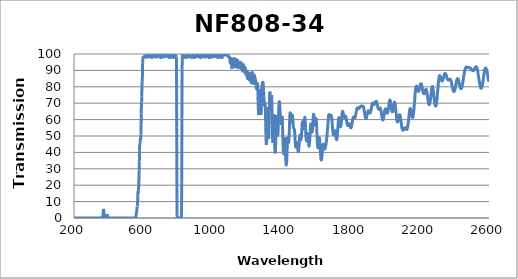
| Category | Transmission (%) |
|---|---|
| 2600.0 | 83.249 |
| 2599.0 | 83.474 |
| 2598.0 | 83.805 |
| 2597.0 | 84.233 |
| 2596.0 | 84.768 |
| 2595.0 | 85.304 |
| 2594.0 | 85.898 |
| 2593.0 | 86.514 |
| 2592.0 | 87.123 |
| 2591.0 | 87.732 |
| 2590.0 | 88.328 |
| 2589.0 | 88.871 |
| 2588.0 | 89.407 |
| 2587.0 | 89.887 |
| 2586.0 | 90.31 |
| 2585.0 | 90.655 |
| 2584.0 | 90.932 |
| 2583.0 | 91.135 |
| 2582.0 | 91.355 |
| 2581.0 | 91.422 |
| 2580.0 | 91.437 |
| 2579.0 | 91.336 |
| 2578.0 | 91.164 |
| 2577.0 | 90.976 |
| 2576.0 | 90.688 |
| 2575.0 | 90.374 |
| 2574.0 | 89.967 |
| 2573.0 | 89.405 |
| 2572.0 | 88.771 |
| 2571.0 | 88.119 |
| 2570.0 | 87.284 |
| 2569.0 | 86.465 |
| 2568.0 | 85.613 |
| 2567.0 | 84.791 |
| 2566.0 | 83.966 |
| 2565.0 | 83.229 |
| 2564.0 | 82.455 |
| 2563.0 | 81.78 |
| 2562.0 | 81.177 |
| 2561.0 | 80.667 |
| 2560.0 | 80.219 |
| 2559.0 | 79.85 |
| 2558.0 | 79.559 |
| 2557.0 | 79.34 |
| 2556.0 | 79.2 |
| 2555.0 | 79.101 |
| 2554.0 | 79.089 |
| 2553.0 | 79.155 |
| 2552.0 | 79.296 |
| 2551.0 | 79.513 |
| 2550.0 | 79.869 |
| 2549.0 | 80.3 |
| 2548.0 | 80.812 |
| 2547.0 | 81.37 |
| 2546.0 | 81.942 |
| 2545.0 | 82.56 |
| 2544.0 | 83.208 |
| 2543.0 | 83.871 |
| 2542.0 | 84.523 |
| 2541.0 | 85.224 |
| 2540.0 | 85.911 |
| 2539.0 | 86.58 |
| 2538.0 | 87.285 |
| 2537.0 | 87.954 |
| 2536.0 | 88.644 |
| 2535.0 | 89.293 |
| 2534.0 | 89.881 |
| 2533.0 | 90.419 |
| 2532.0 | 90.877 |
| 2531.0 | 91.323 |
| 2530.0 | 91.643 |
| 2529.0 | 91.861 |
| 2528.0 | 92.079 |
| 2527.0 | 92.198 |
| 2526.0 | 92.234 |
| 2525.0 | 92.279 |
| 2524.0 | 92.254 |
| 2523.0 | 92.177 |
| 2522.0 | 92.034 |
| 2521.0 | 91.86 |
| 2520.0 | 91.684 |
| 2519.0 | 91.476 |
| 2518.0 | 91.227 |
| 2517.0 | 91.018 |
| 2516.0 | 90.808 |
| 2515.0 | 90.555 |
| 2514.0 | 90.349 |
| 2513.0 | 90.176 |
| 2512.0 | 90.049 |
| 2511.0 | 89.955 |
| 2510.0 | 89.863 |
| 2509.0 | 89.808 |
| 2508.0 | 89.789 |
| 2507.0 | 89.793 |
| 2506.0 | 89.842 |
| 2505.0 | 89.918 |
| 2504.0 | 90.023 |
| 2503.0 | 90.138 |
| 2502.0 | 90.24 |
| 2501.0 | 90.337 |
| 2500.0 | 90.447 |
| 2499.0 | 90.594 |
| 2498.0 | 90.768 |
| 2497.0 | 90.912 |
| 2496.0 | 91.064 |
| 2495.0 | 91.179 |
| 2494.0 | 91.26 |
| 2493.0 | 91.336 |
| 2492.0 | 91.417 |
| 2491.0 | 91.494 |
| 2490.0 | 91.554 |
| 2489.0 | 91.598 |
| 2488.0 | 91.65 |
| 2487.0 | 91.678 |
| 2486.0 | 91.663 |
| 2485.0 | 91.653 |
| 2484.0 | 91.689 |
| 2483.0 | 91.732 |
| 2482.0 | 91.744 |
| 2481.0 | 91.757 |
| 2480.0 | 91.778 |
| 2479.0 | 91.787 |
| 2478.0 | 91.803 |
| 2477.0 | 91.833 |
| 2476.0 | 91.89 |
| 2475.0 | 91.925 |
| 2474.0 | 91.972 |
| 2473.0 | 91.999 |
| 2472.0 | 92.037 |
| 2471.0 | 92.051 |
| 2470.0 | 92.058 |
| 2469.0 | 92.045 |
| 2468.0 | 92.013 |
| 2467.0 | 91.921 |
| 2466.0 | 91.786 |
| 2465.0 | 91.591 |
| 2464.0 | 91.369 |
| 2463.0 | 91.117 |
| 2462.0 | 90.786 |
| 2461.0 | 90.395 |
| 2460.0 | 89.966 |
| 2459.0 | 89.498 |
| 2458.0 | 88.992 |
| 2457.0 | 88.429 |
| 2456.0 | 87.829 |
| 2455.0 | 87.164 |
| 2454.0 | 86.479 |
| 2453.0 | 85.783 |
| 2452.0 | 85.083 |
| 2451.0 | 84.397 |
| 2450.0 | 83.703 |
| 2449.0 | 83.022 |
| 2448.0 | 82.385 |
| 2447.0 | 81.786 |
| 2446.0 | 81.225 |
| 2445.0 | 80.699 |
| 2444.0 | 80.219 |
| 2443.0 | 79.833 |
| 2442.0 | 79.511 |
| 2441.0 | 79.226 |
| 2440.0 | 79.014 |
| 2439.0 | 78.884 |
| 2438.0 | 78.842 |
| 2437.0 | 78.886 |
| 2436.0 | 79.028 |
| 2435.0 | 79.235 |
| 2434.0 | 79.479 |
| 2433.0 | 79.78 |
| 2432.0 | 80.137 |
| 2431.0 | 80.578 |
| 2430.0 | 81.059 |
| 2429.0 | 81.555 |
| 2428.0 | 82.057 |
| 2427.0 | 82.557 |
| 2426.0 | 83.053 |
| 2425.0 | 83.503 |
| 2424.0 | 83.909 |
| 2423.0 | 84.267 |
| 2422.0 | 84.576 |
| 2421.0 | 84.802 |
| 2420.0 | 84.936 |
| 2419.0 | 84.987 |
| 2418.0 | 84.958 |
| 2417.0 | 84.858 |
| 2416.0 | 84.704 |
| 2415.0 | 84.451 |
| 2414.0 | 84.08 |
| 2413.0 | 83.666 |
| 2412.0 | 83.191 |
| 2411.0 | 82.644 |
| 2410.0 | 82.121 |
| 2409.0 | 81.589 |
| 2408.0 | 81.003 |
| 2407.0 | 80.43 |
| 2406.0 | 79.873 |
| 2405.0 | 79.322 |
| 2404.0 | 78.833 |
| 2403.0 | 78.382 |
| 2402.0 | 77.973 |
| 2401.0 | 77.652 |
| 2400.0 | 77.399 |
| 2399.0 | 77.225 |
| 2398.0 | 77.127 |
| 2397.0 | 77.105 |
| 2396.0 | 77.162 |
| 2395.0 | 77.265 |
| 2394.0 | 77.455 |
| 2393.0 | 77.736 |
| 2392.0 | 78.069 |
| 2391.0 | 78.462 |
| 2390.0 | 78.916 |
| 2389.0 | 79.401 |
| 2388.0 | 79.928 |
| 2387.0 | 80.481 |
| 2386.0 | 81.006 |
| 2385.0 | 81.531 |
| 2384.0 | 82.045 |
| 2383.0 | 82.517 |
| 2382.0 | 82.941 |
| 2381.0 | 83.339 |
| 2380.0 | 83.682 |
| 2379.0 | 83.998 |
| 2378.0 | 84.236 |
| 2377.0 | 84.389 |
| 2376.0 | 84.501 |
| 2375.0 | 84.576 |
| 2374.0 | 84.596 |
| 2373.0 | 84.561 |
| 2372.0 | 84.548 |
| 2371.0 | 84.515 |
| 2370.0 | 84.426 |
| 2369.0 | 84.33 |
| 2368.0 | 84.231 |
| 2367.0 | 84.155 |
| 2366.0 | 84.112 |
| 2365.0 | 84.076 |
| 2364.0 | 84.087 |
| 2363.0 | 84.155 |
| 2362.0 | 84.274 |
| 2361.0 | 84.426 |
| 2360.0 | 84.624 |
| 2359.0 | 84.848 |
| 2358.0 | 85.116 |
| 2357.0 | 85.423 |
| 2356.0 | 85.768 |
| 2355.0 | 86.133 |
| 2354.0 | 86.492 |
| 2353.0 | 86.843 |
| 2352.0 | 87.151 |
| 2351.0 | 87.448 |
| 2350.0 | 87.695 |
| 2349.0 | 87.897 |
| 2348.0 | 88.068 |
| 2347.0 | 88.184 |
| 2346.0 | 88.223 |
| 2345.0 | 88.169 |
| 2344.0 | 88.028 |
| 2343.0 | 87.819 |
| 2342.0 | 87.526 |
| 2341.0 | 87.204 |
| 2340.0 | 86.854 |
| 2339.0 | 86.477 |
| 2338.0 | 86.07 |
| 2337.0 | 85.651 |
| 2336.0 | 85.237 |
| 2335.0 | 84.835 |
| 2334.0 | 84.47 |
| 2333.0 | 84.167 |
| 2332.0 | 83.926 |
| 2331.0 | 83.703 |
| 2330.0 | 83.546 |
| 2329.0 | 83.49 |
| 2328.0 | 83.514 |
| 2327.0 | 83.594 |
| 2326.0 | 83.76 |
| 2325.0 | 83.991 |
| 2324.0 | 84.255 |
| 2323.0 | 84.571 |
| 2322.0 | 84.916 |
| 2321.0 | 85.287 |
| 2320.0 | 85.66 |
| 2319.0 | 86.018 |
| 2318.0 | 86.343 |
| 2317.0 | 86.623 |
| 2316.0 | 86.795 |
| 2315.0 | 86.84 |
| 2314.0 | 86.765 |
| 2313.0 | 86.53 |
| 2312.0 | 86.13 |
| 2311.0 | 85.584 |
| 2310.0 | 84.931 |
| 2309.0 | 84.146 |
| 2308.0 | 83.176 |
| 2307.0 | 82.114 |
| 2306.0 | 80.982 |
| 2305.0 | 79.713 |
| 2304.0 | 78.455 |
| 2303.0 | 77.16 |
| 2302.0 | 75.9 |
| 2301.0 | 74.7 |
| 2300.0 | 73.563 |
| 2299.0 | 72.479 |
| 2298.0 | 71.514 |
| 2297.0 | 70.598 |
| 2296.0 | 69.846 |
| 2295.0 | 69.229 |
| 2294.0 | 68.796 |
| 2293.0 | 68.467 |
| 2292.0 | 68.27 |
| 2291.0 | 68.216 |
| 2290.0 | 68.309 |
| 2289.0 | 68.523 |
| 2288.0 | 68.891 |
| 2287.0 | 69.395 |
| 2286.0 | 70.005 |
| 2285.0 | 70.811 |
| 2284.0 | 71.626 |
| 2283.0 | 72.534 |
| 2282.0 | 73.488 |
| 2281.0 | 74.469 |
| 2280.0 | 75.503 |
| 2279.0 | 76.525 |
| 2278.0 | 77.438 |
| 2277.0 | 78.274 |
| 2276.0 | 78.981 |
| 2275.0 | 79.543 |
| 2274.0 | 79.959 |
| 2273.0 | 80.164 |
| 2272.0 | 80.154 |
| 2271.0 | 79.959 |
| 2270.0 | 79.587 |
| 2269.0 | 79.031 |
| 2268.0 | 78.33 |
| 2267.0 | 77.513 |
| 2266.0 | 76.648 |
| 2265.0 | 75.7 |
| 2264.0 | 74.772 |
| 2263.0 | 73.795 |
| 2262.0 | 72.914 |
| 2261.0 | 72.054 |
| 2260.0 | 71.293 |
| 2259.0 | 70.619 |
| 2258.0 | 70.057 |
| 2257.0 | 69.633 |
| 2256.0 | 69.33 |
| 2255.0 | 69.157 |
| 2254.0 | 69.1 |
| 2253.0 | 69.189 |
| 2252.0 | 69.394 |
| 2251.0 | 69.725 |
| 2250.0 | 70.163 |
| 2249.0 | 70.71 |
| 2248.0 | 71.338 |
| 2247.0 | 72.028 |
| 2246.0 | 72.734 |
| 2245.0 | 73.535 |
| 2244.0 | 74.318 |
| 2243.0 | 75.073 |
| 2242.0 | 75.852 |
| 2241.0 | 76.521 |
| 2240.0 | 77.118 |
| 2239.0 | 77.642 |
| 2238.0 | 77.984 |
| 2237.0 | 78.269 |
| 2236.0 | 78.424 |
| 2235.0 | 78.451 |
| 2234.0 | 78.373 |
| 2233.0 | 78.232 |
| 2232.0 | 77.987 |
| 2231.0 | 77.664 |
| 2230.0 | 77.312 |
| 2229.0 | 76.936 |
| 2228.0 | 76.617 |
| 2227.0 | 76.305 |
| 2226.0 | 76.087 |
| 2225.0 | 75.903 |
| 2224.0 | 75.802 |
| 2223.0 | 75.768 |
| 2222.0 | 75.858 |
| 2221.0 | 76.038 |
| 2220.0 | 76.29 |
| 2219.0 | 76.652 |
| 2218.0 | 77.065 |
| 2217.0 | 77.531 |
| 2216.0 | 78.082 |
| 2215.0 | 78.596 |
| 2214.0 | 79.158 |
| 2213.0 | 79.728 |
| 2212.0 | 80.239 |
| 2211.0 | 80.757 |
| 2210.0 | 81.196 |
| 2209.0 | 81.544 |
| 2208.0 | 81.779 |
| 2207.0 | 81.898 |
| 2206.0 | 81.888 |
| 2205.0 | 81.82 |
| 2204.0 | 81.619 |
| 2203.0 | 81.288 |
| 2202.0 | 80.915 |
| 2201.0 | 80.48 |
| 2200.0 | 79.928 |
| 2199.0 | 79.421 |
| 2198.0 | 78.903 |
| 2197.0 | 78.436 |
| 2196.0 | 78 |
| 2195.0 | 77.657 |
| 2194.0 | 77.357 |
| 2193.0 | 77.207 |
| 2192.0 | 77.171 |
| 2191.0 | 77.179 |
| 2190.0 | 77.275 |
| 2189.0 | 77.501 |
| 2188.0 | 77.845 |
| 2187.0 | 78.22 |
| 2186.0 | 78.633 |
| 2185.0 | 79.123 |
| 2184.0 | 79.543 |
| 2183.0 | 79.956 |
| 2182.0 | 80.265 |
| 2181.0 | 80.436 |
| 2180.0 | 80.454 |
| 2179.0 | 80.305 |
| 2178.0 | 80.031 |
| 2177.0 | 79.539 |
| 2176.0 | 78.858 |
| 2175.0 | 78.005 |
| 2174.0 | 77.033 |
| 2173.0 | 75.858 |
| 2172.0 | 74.599 |
| 2171.0 | 73.21 |
| 2170.0 | 71.83 |
| 2169.0 | 70.433 |
| 2168.0 | 69.056 |
| 2167.0 | 67.814 |
| 2166.0 | 66.551 |
| 2165.0 | 65.359 |
| 2164.0 | 64.316 |
| 2163.0 | 63.41 |
| 2162.0 | 62.644 |
| 2161.0 | 62.075 |
| 2160.0 | 61.613 |
| 2159.0 | 61.357 |
| 2158.0 | 61.255 |
| 2157.0 | 61.315 |
| 2156.0 | 61.529 |
| 2155.0 | 61.834 |
| 2154.0 | 62.274 |
| 2153.0 | 62.85 |
| 2152.0 | 63.454 |
| 2151.0 | 64.109 |
| 2150.0 | 64.701 |
| 2149.0 | 65.309 |
| 2148.0 | 65.852 |
| 2147.0 | 66.33 |
| 2146.0 | 66.629 |
| 2145.0 | 66.784 |
| 2144.0 | 66.767 |
| 2143.0 | 66.577 |
| 2142.0 | 66.204 |
| 2141.0 | 65.656 |
| 2140.0 | 64.95 |
| 2139.0 | 64.124 |
| 2138.0 | 63.221 |
| 2137.0 | 62.242 |
| 2136.0 | 61.244 |
| 2135.0 | 60.219 |
| 2134.0 | 59.216 |
| 2133.0 | 58.322 |
| 2132.0 | 57.454 |
| 2131.0 | 56.661 |
| 2130.0 | 55.979 |
| 2129.0 | 55.398 |
| 2128.0 | 54.879 |
| 2127.0 | 54.474 |
| 2126.0 | 54.189 |
| 2125.0 | 54.002 |
| 2124.0 | 53.918 |
| 2123.0 | 53.888 |
| 2122.0 | 53.932 |
| 2121.0 | 54.045 |
| 2120.0 | 54.211 |
| 2119.0 | 54.381 |
| 2118.0 | 54.547 |
| 2117.0 | 54.711 |
| 2116.0 | 54.874 |
| 2115.0 | 55.017 |
| 2114.0 | 55.076 |
| 2113.0 | 55.078 |
| 2112.0 | 55.018 |
| 2111.0 | 54.928 |
| 2110.0 | 54.751 |
| 2109.0 | 54.551 |
| 2108.0 | 54.329 |
| 2107.0 | 54.128 |
| 2106.0 | 53.94 |
| 2105.0 | 53.751 |
| 2104.0 | 53.593 |
| 2103.0 | 53.499 |
| 2102.0 | 53.487 |
| 2101.0 | 53.571 |
| 2100.0 | 53.756 |
| 2099.0 | 54.024 |
| 2098.0 | 54.39 |
| 2097.0 | 54.872 |
| 2096.0 | 55.413 |
| 2095.0 | 56.024 |
| 2094.0 | 56.726 |
| 2093.0 | 57.469 |
| 2092.0 | 58.264 |
| 2091.0 | 59.105 |
| 2090.0 | 59.864 |
| 2089.0 | 60.621 |
| 2088.0 | 61.308 |
| 2087.0 | 61.912 |
| 2086.0 | 62.417 |
| 2085.0 | 62.8 |
| 2084.0 | 62.962 |
| 2083.0 | 62.984 |
| 2082.0 | 62.865 |
| 2081.0 | 62.616 |
| 2080.0 | 62.271 |
| 2079.0 | 61.804 |
| 2078.0 | 61.25 |
| 2077.0 | 60.676 |
| 2076.0 | 60.149 |
| 2075.0 | 59.65 |
| 2074.0 | 59.236 |
| 2073.0 | 58.898 |
| 2072.0 | 58.663 |
| 2071.0 | 58.574 |
| 2070.0 | 58.662 |
| 2069.0 | 58.888 |
| 2068.0 | 59.265 |
| 2067.0 | 59.809 |
| 2066.0 | 60.509 |
| 2065.0 | 61.366 |
| 2064.0 | 62.323 |
| 2063.0 | 63.346 |
| 2062.0 | 64.413 |
| 2061.0 | 65.501 |
| 2060.0 | 66.61 |
| 2059.0 | 67.658 |
| 2058.0 | 68.571 |
| 2057.0 | 69.347 |
| 2056.0 | 69.934 |
| 2055.0 | 70.331 |
| 2054.0 | 70.536 |
| 2053.0 | 70.503 |
| 2052.0 | 70.273 |
| 2051.0 | 69.886 |
| 2050.0 | 69.373 |
| 2049.0 | 68.778 |
| 2048.0 | 68.129 |
| 2047.0 | 67.421 |
| 2046.0 | 66.72 |
| 2045.0 | 66.098 |
| 2044.0 | 65.582 |
| 2043.0 | 65.161 |
| 2042.0 | 64.858 |
| 2041.0 | 64.741 |
| 2040.0 | 64.805 |
| 2039.0 | 65.001 |
| 2038.0 | 65.344 |
| 2037.0 | 65.849 |
| 2036.0 | 66.507 |
| 2035.0 | 67.25 |
| 2034.0 | 68.054 |
| 2033.0 | 68.863 |
| 2032.0 | 69.651 |
| 2031.0 | 70.418 |
| 2030.0 | 71.074 |
| 2029.0 | 71.562 |
| 2028.0 | 71.873 |
| 2027.0 | 71.985 |
| 2026.0 | 71.891 |
| 2025.0 | 71.597 |
| 2024.0 | 71.101 |
| 2023.0 | 70.455 |
| 2022.0 | 69.723 |
| 2021.0 | 68.923 |
| 2020.0 | 68.069 |
| 2019.0 | 67.228 |
| 2018.0 | 66.405 |
| 2017.0 | 65.689 |
| 2016.0 | 65.101 |
| 2015.0 | 64.599 |
| 2014.0 | 64.206 |
| 2013.0 | 63.969 |
| 2012.0 | 63.907 |
| 2011.0 | 63.945 |
| 2010.0 | 64.067 |
| 2009.0 | 64.289 |
| 2008.0 | 64.602 |
| 2007.0 | 64.981 |
| 2006.0 | 65.38 |
| 2005.0 | 65.771 |
| 2004.0 | 66.124 |
| 2003.0 | 66.39 |
| 2002.0 | 66.546 |
| 2001.0 | 66.607 |
| 2000.0 | 66.519 |
| 1999.0 | 66.27 |
| 1998.0 | 65.881 |
| 1997.0 | 65.349 |
| 1996.0 | 64.723 |
| 1995.0 | 64.049 |
| 1994.0 | 63.316 |
| 1993.0 | 62.575 |
| 1992.0 | 61.868 |
| 1991.0 | 61.228 |
| 1990.0 | 60.678 |
| 1989.0 | 60.237 |
| 1988.0 | 59.92 |
| 1987.0 | 59.765 |
| 1986.0 | 59.75 |
| 1985.0 | 59.866 |
| 1984.0 | 60.108 |
| 1983.0 | 60.491 |
| 1982.0 | 60.993 |
| 1981.0 | 61.588 |
| 1980.0 | 62.263 |
| 1979.0 | 62.965 |
| 1978.0 | 63.67 |
| 1977.0 | 64.372 |
| 1976.0 | 65.02 |
| 1975.0 | 65.598 |
| 1974.0 | 66.093 |
| 1973.0 | 66.479 |
| 1972.0 | 66.759 |
| 1971.0 | 66.941 |
| 1970.0 | 67.028 |
| 1969.0 | 67.033 |
| 1968.0 | 66.954 |
| 1967.0 | 66.836 |
| 1966.0 | 66.706 |
| 1965.0 | 66.547 |
| 1964.0 | 66.392 |
| 1963.0 | 66.322 |
| 1962.0 | 66.326 |
| 1961.0 | 66.405 |
| 1960.0 | 66.578 |
| 1959.0 | 66.813 |
| 1958.0 | 67.147 |
| 1957.0 | 67.541 |
| 1956.0 | 68.018 |
| 1955.0 | 68.531 |
| 1954.0 | 69.027 |
| 1953.0 | 69.539 |
| 1952.0 | 70.044 |
| 1951.0 | 70.466 |
| 1950.0 | 70.789 |
| 1949.0 | 71.009 |
| 1948.0 | 71.152 |
| 1947.0 | 71.174 |
| 1946.0 | 71.084 |
| 1945.0 | 70.908 |
| 1944.0 | 70.678 |
| 1943.0 | 70.458 |
| 1942.0 | 70.216 |
| 1941.0 | 69.945 |
| 1940.0 | 69.684 |
| 1939.0 | 69.465 |
| 1938.0 | 69.309 |
| 1937.0 | 69.225 |
| 1936.0 | 69.23 |
| 1935.0 | 69.303 |
| 1934.0 | 69.426 |
| 1933.0 | 69.563 |
| 1932.0 | 69.696 |
| 1931.0 | 69.924 |
| 1930.0 | 70.042 |
| 1929.0 | 70.085 |
| 1928.0 | 70.131 |
| 1927.0 | 70.096 |
| 1926.0 | 69.947 |
| 1925.0 | 69.694 |
| 1924.0 | 69.388 |
| 1923.0 | 68.986 |
| 1922.0 | 68.415 |
| 1921.0 | 67.743 |
| 1920.0 | 67.097 |
| 1919.0 | 66.434 |
| 1918.0 | 65.832 |
| 1917.0 | 65.408 |
| 1916.0 | 65.037 |
| 1915.0 | 64.698 |
| 1914.0 | 64.374 |
| 1913.0 | 64.11 |
| 1912.0 | 63.996 |
| 1911.0 | 63.995 |
| 1910.0 | 64.123 |
| 1909.0 | 64.347 |
| 1908.0 | 64.591 |
| 1907.0 | 64.829 |
| 1906.0 | 65.067 |
| 1905.0 | 65.213 |
| 1904.0 | 65.305 |
| 1903.0 | 65.37 |
| 1902.0 | 65.399 |
| 1901.0 | 65.263 |
| 1900.0 | 64.995 |
| 1899.0 | 64.59 |
| 1898.0 | 64.083 |
| 1897.0 | 63.656 |
| 1896.0 | 63.271 |
| 1895.0 | 62.801 |
| 1894.0 | 62.384 |
| 1893.0 | 61.929 |
| 1892.0 | 61.418 |
| 1891.0 | 61.011 |
| 1890.0 | 60.722 |
| 1889.0 | 60.571 |
| 1888.0 | 60.659 |
| 1887.0 | 60.813 |
| 1886.0 | 61.084 |
| 1885.0 | 61.467 |
| 1884.0 | 61.934 |
| 1883.0 | 62.49 |
| 1882.0 | 63.081 |
| 1881.0 | 63.796 |
| 1880.0 | 64.547 |
| 1879.0 | 65.26 |
| 1878.0 | 65.977 |
| 1877.0 | 66.532 |
| 1876.0 | 67.002 |
| 1875.0 | 67.437 |
| 1874.0 | 67.775 |
| 1873.0 | 67.925 |
| 1872.0 | 68.081 |
| 1871.0 | 68.161 |
| 1870.0 | 68.192 |
| 1869.0 | 68.178 |
| 1868.0 | 68.202 |
| 1867.0 | 68.147 |
| 1866.0 | 68.214 |
| 1865.0 | 68.241 |
| 1864.0 | 68.259 |
| 1863.0 | 68.309 |
| 1862.0 | 68.328 |
| 1861.0 | 68.252 |
| 1860.0 | 68.213 |
| 1859.0 | 68.133 |
| 1858.0 | 68.037 |
| 1857.0 | 68.001 |
| 1856.0 | 67.958 |
| 1855.0 | 67.878 |
| 1854.0 | 67.724 |
| 1853.0 | 67.516 |
| 1852.0 | 67.318 |
| 1851.0 | 67.204 |
| 1850.0 | 67.13 |
| 1849.0 | 67.065 |
| 1848.0 | 66.965 |
| 1847.0 | 66.722 |
| 1846.0 | 66.746 |
| 1845.0 | 66.655 |
| 1844.0 | 66.873 |
| 1843.0 | 67.127 |
| 1842.0 | 67.297 |
| 1841.0 | 67.256 |
| 1840.0 | 67.171 |
| 1839.0 | 67.189 |
| 1838.0 | 67.072 |
| 1837.0 | 66.866 |
| 1836.0 | 66.585 |
| 1835.0 | 66.172 |
| 1834.0 | 65.758 |
| 1833.0 | 65.332 |
| 1832.0 | 64.832 |
| 1831.0 | 64.188 |
| 1830.0 | 63.442 |
| 1829.0 | 62.856 |
| 1828.0 | 62.355 |
| 1827.0 | 61.861 |
| 1826.0 | 61.452 |
| 1825.0 | 61.223 |
| 1824.0 | 61.137 |
| 1823.0 | 61.194 |
| 1822.0 | 61.27 |
| 1821.0 | 61.267 |
| 1820.0 | 61.205 |
| 1819.0 | 61.309 |
| 1818.0 | 61.395 |
| 1817.0 | 61.541 |
| 1816.0 | 61.554 |
| 1815.0 | 61.42 |
| 1814.0 | 61.141 |
| 1813.0 | 60.786 |
| 1812.0 | 60.249 |
| 1811.0 | 59.617 |
| 1810.0 | 58.944 |
| 1809.0 | 58.303 |
| 1808.0 | 57.673 |
| 1807.0 | 57.055 |
| 1806.0 | 56.429 |
| 1805.0 | 55.85 |
| 1804.0 | 55.429 |
| 1803.0 | 55.118 |
| 1802.0 | 55.003 |
| 1801.0 | 54.981 |
| 1800.0 | 55.069 |
| 1799.0 | 55.275 |
| 1798.0 | 55.598 |
| 1797.0 | 55.994 |
| 1796.0 | 56.356 |
| 1795.0 | 56.716 |
| 1794.0 | 57.027 |
| 1793.0 | 57.246 |
| 1792.0 | 57.394 |
| 1791.0 | 57.432 |
| 1790.0 | 57.374 |
| 1789.0 | 57.225 |
| 1788.0 | 57.032 |
| 1787.0 | 56.83 |
| 1786.0 | 56.628 |
| 1785.0 | 56.441 |
| 1784.0 | 56.334 |
| 1783.0 | 56.381 |
| 1782.0 | 56.512 |
| 1781.0 | 56.777 |
| 1780.0 | 57.158 |
| 1779.0 | 57.686 |
| 1778.0 | 58.274 |
| 1777.0 | 58.909 |
| 1776.0 | 59.587 |
| 1775.0 | 60.25 |
| 1774.0 | 60.842 |
| 1773.0 | 61.345 |
| 1772.0 | 61.732 |
| 1771.0 | 61.997 |
| 1770.0 | 62.123 |
| 1769.0 | 62.105 |
| 1768.0 | 61.979 |
| 1767.0 | 61.795 |
| 1766.0 | 61.583 |
| 1765.0 | 61.402 |
| 1764.0 | 61.302 |
| 1763.0 | 61.303 |
| 1762.0 | 61.412 |
| 1761.0 | 61.664 |
| 1760.0 | 62.069 |
| 1759.0 | 62.602 |
| 1758.0 | 63.197 |
| 1757.0 | 63.804 |
| 1756.0 | 64.353 |
| 1755.0 | 64.79 |
| 1754.0 | 65.035 |
| 1753.0 | 65.004 |
| 1752.0 | 64.694 |
| 1751.0 | 64.103 |
| 1750.0 | 63.201 |
| 1749.0 | 62.122 |
| 1748.0 | 60.922 |
| 1747.0 | 59.67 |
| 1746.0 | 58.465 |
| 1745.0 | 57.425 |
| 1744.0 | 56.573 |
| 1743.0 | 55.968 |
| 1742.0 | 55.634 |
| 1741.0 | 55.629 |
| 1740.0 | 55.879 |
| 1739.0 | 56.36 |
| 1738.0 | 57.062 |
| 1737.0 | 57.93 |
| 1736.0 | 58.853 |
| 1735.0 | 59.746 |
| 1734.0 | 60.502 |
| 1733.0 | 61.019 |
| 1732.0 | 61.202 |
| 1731.0 | 60.996 |
| 1730.0 | 60.382 |
| 1729.0 | 59.385 |
| 1728.0 | 58.072 |
| 1727.0 | 56.499 |
| 1726.0 | 54.842 |
| 1725.0 | 53.216 |
| 1724.0 | 51.716 |
| 1723.0 | 50.41 |
| 1722.0 | 49.279 |
| 1721.0 | 48.463 |
| 1720.0 | 47.953 |
| 1719.0 | 47.75 |
| 1718.0 | 47.842 |
| 1717.0 | 48.198 |
| 1716.0 | 48.79 |
| 1715.0 | 49.564 |
| 1714.0 | 50.437 |
| 1713.0 | 51.29 |
| 1712.0 | 52.086 |
| 1711.0 | 52.718 |
| 1710.0 | 53.123 |
| 1709.0 | 53.27 |
| 1708.0 | 53.169 |
| 1707.0 | 52.86 |
| 1706.0 | 52.392 |
| 1705.0 | 51.863 |
| 1704.0 | 51.34 |
| 1703.0 | 50.913 |
| 1702.0 | 50.642 |
| 1701.0 | 50.581 |
| 1700.0 | 50.768 |
| 1699.0 | 51.22 |
| 1698.0 | 51.946 |
| 1697.0 | 52.836 |
| 1696.0 | 53.944 |
| 1695.0 | 55.206 |
| 1694.0 | 56.551 |
| 1693.0 | 57.914 |
| 1692.0 | 59.209 |
| 1691.0 | 60.341 |
| 1690.0 | 61.268 |
| 1689.0 | 61.953 |
| 1688.0 | 62.372 |
| 1687.0 | 62.546 |
| 1686.0 | 62.55 |
| 1685.0 | 62.418 |
| 1684.0 | 62.225 |
| 1683.0 | 62.032 |
| 1682.0 | 61.905 |
| 1681.0 | 61.889 |
| 1680.0 | 61.981 |
| 1679.0 | 62.181 |
| 1678.0 | 62.469 |
| 1677.0 | 62.779 |
| 1676.0 | 63.013 |
| 1675.0 | 63.07 |
| 1674.0 | 62.93 |
| 1673.0 | 62.512 |
| 1672.0 | 61.803 |
| 1671.0 | 60.834 |
| 1670.0 | 59.627 |
| 1669.0 | 58.209 |
| 1668.0 | 56.73 |
| 1667.0 | 55.29 |
| 1666.0 | 53.816 |
| 1665.0 | 52.448 |
| 1664.0 | 51.177 |
| 1663.0 | 50.021 |
| 1662.0 | 48.987 |
| 1661.0 | 48.082 |
| 1660.0 | 47.263 |
| 1659.0 | 46.467 |
| 1658.0 | 45.712 |
| 1657.0 | 45.027 |
| 1656.0 | 44.38 |
| 1655.0 | 43.773 |
| 1654.0 | 43.229 |
| 1653.0 | 42.754 |
| 1652.0 | 42.393 |
| 1651.0 | 42.162 |
| 1650.0 | 42.049 |
| 1649.0 | 42.089 |
| 1648.0 | 42.293 |
| 1647.0 | 42.643 |
| 1646.0 | 43.109 |
| 1645.0 | 43.674 |
| 1644.0 | 44.237 |
| 1643.0 | 44.677 |
| 1642.0 | 44.95 |
| 1641.0 | 44.972 |
| 1640.0 | 44.679 |
| 1639.0 | 44.036 |
| 1638.0 | 43.072 |
| 1637.0 | 41.889 |
| 1636.0 | 40.555 |
| 1635.0 | 39.172 |
| 1634.0 | 37.901 |
| 1633.0 | 36.794 |
| 1632.0 | 35.96 |
| 1631.0 | 35.476 |
| 1630.0 | 35.324 |
| 1629.0 | 35.544 |
| 1628.0 | 36.149 |
| 1627.0 | 37.163 |
| 1626.0 | 38.533 |
| 1625.0 | 40.255 |
| 1624.0 | 42.205 |
| 1623.0 | 44.16 |
| 1622.0 | 46.039 |
| 1621.0 | 47.577 |
| 1620.0 | 48.573 |
| 1619.0 | 48.999 |
| 1618.0 | 48.838 |
| 1617.0 | 48.159 |
| 1616.0 | 47.105 |
| 1615.0 | 45.889 |
| 1614.0 | 44.732 |
| 1613.0 | 43.737 |
| 1612.0 | 43.048 |
| 1611.0 | 42.771 |
| 1610.0 | 42.961 |
| 1609.0 | 43.649 |
| 1608.0 | 44.836 |
| 1607.0 | 46.525 |
| 1606.0 | 48.629 |
| 1605.0 | 51.028 |
| 1604.0 | 53.58 |
| 1603.0 | 56.047 |
| 1602.0 | 58.151 |
| 1601.0 | 59.694 |
| 1600.0 | 60.516 |
| 1599.0 | 60.568 |
| 1598.0 | 60.015 |
| 1597.0 | 59.11 |
| 1596.0 | 58.105 |
| 1595.0 | 57.221 |
| 1594.0 | 56.678 |
| 1593.0 | 56.58 |
| 1592.0 | 56.936 |
| 1591.0 | 57.752 |
| 1590.0 | 58.948 |
| 1589.0 | 60.325 |
| 1588.0 | 61.648 |
| 1587.0 | 62.708 |
| 1586.0 | 63.255 |
| 1585.0 | 63.102 |
| 1584.0 | 62.25 |
| 1583.0 | 60.869 |
| 1582.0 | 59.099 |
| 1581.0 | 57.254 |
| 1580.0 | 55.519 |
| 1579.0 | 54.052 |
| 1578.0 | 52.986 |
| 1577.0 | 52.41 |
| 1576.0 | 52.36 |
| 1575.0 | 52.792 |
| 1574.0 | 53.612 |
| 1573.0 | 54.71 |
| 1572.0 | 55.843 |
| 1571.0 | 56.793 |
| 1570.0 | 57.322 |
| 1569.0 | 57.295 |
| 1568.0 | 56.58 |
| 1567.0 | 55.181 |
| 1566.0 | 53.302 |
| 1565.0 | 51.202 |
| 1564.0 | 49.046 |
| 1563.0 | 47.049 |
| 1562.0 | 45.513 |
| 1561.0 | 44.417 |
| 1560.0 | 43.857 |
| 1559.0 | 43.864 |
| 1558.0 | 44.389 |
| 1557.0 | 45.409 |
| 1556.0 | 46.7 |
| 1555.0 | 48.134 |
| 1554.0 | 49.494 |
| 1553.0 | 50.604 |
| 1552.0 | 51.233 |
| 1551.0 | 51.311 |
| 1550.0 | 50.867 |
| 1549.0 | 50.022 |
| 1548.0 | 48.985 |
| 1547.0 | 48.025 |
| 1546.0 | 47.302 |
| 1545.0 | 46.969 |
| 1544.0 | 47.132 |
| 1543.0 | 47.868 |
| 1542.0 | 49.15 |
| 1541.0 | 50.951 |
| 1540.0 | 53.094 |
| 1539.0 | 55.484 |
| 1538.0 | 57.776 |
| 1537.0 | 59.631 |
| 1536.0 | 60.964 |
| 1535.0 | 61.417 |
| 1534.0 | 61.047 |
| 1533.0 | 60.041 |
| 1532.0 | 58.673 |
| 1531.0 | 57.205 |
| 1530.0 | 55.913 |
| 1529.0 | 54.936 |
| 1528.0 | 54.463 |
| 1527.0 | 54.47 |
| 1526.0 | 55.019 |
| 1525.0 | 55.903 |
| 1524.0 | 56.96 |
| 1523.0 | 57.97 |
| 1522.0 | 58.627 |
| 1521.0 | 58.711 |
| 1520.0 | 58.123 |
| 1519.0 | 56.863 |
| 1518.0 | 55.076 |
| 1517.0 | 53.189 |
| 1516.0 | 51.273 |
| 1515.0 | 49.629 |
| 1514.0 | 48.474 |
| 1513.0 | 47.782 |
| 1512.0 | 47.647 |
| 1511.0 | 47.956 |
| 1510.0 | 48.618 |
| 1509.0 | 49.4 |
| 1508.0 | 50.085 |
| 1507.0 | 50.434 |
| 1506.0 | 50.288 |
| 1505.0 | 49.597 |
| 1504.0 | 48.346 |
| 1503.0 | 46.763 |
| 1502.0 | 45.012 |
| 1501.0 | 43.36 |
| 1500.0 | 42.012 |
| 1499.0 | 41.003 |
| 1498.0 | 40.494 |
| 1497.0 | 40.385 |
| 1496.0 | 40.717 |
| 1495.0 | 41.414 |
| 1494.0 | 42.373 |
| 1493.0 | 43.465 |
| 1492.0 | 44.472 |
| 1491.0 | 45.294 |
| 1490.0 | 45.729 |
| 1489.0 | 45.783 |
| 1488.0 | 45.459 |
| 1487.0 | 44.849 |
| 1486.0 | 44.159 |
| 1485.0 | 43.521 |
| 1484.0 | 43.121 |
| 1483.0 | 43.125 |
| 1482.0 | 43.523 |
| 1481.0 | 44.403 |
| 1480.0 | 45.668 |
| 1479.0 | 47.275 |
| 1478.0 | 49.003 |
| 1477.0 | 50.733 |
| 1476.0 | 52.248 |
| 1475.0 | 53.342 |
| 1474.0 | 54.049 |
| 1473.0 | 54.372 |
| 1472.0 | 54.502 |
| 1471.0 | 54.589 |
| 1470.0 | 54.85 |
| 1469.0 | 55.465 |
| 1468.0 | 56.416 |
| 1467.0 | 57.815 |
| 1466.0 | 59.291 |
| 1465.0 | 60.789 |
| 1464.0 | 62.019 |
| 1463.0 | 62.722 |
| 1462.0 | 62.84 |
| 1461.0 | 62.312 |
| 1460.0 | 61.348 |
| 1459.0 | 60.221 |
| 1458.0 | 59.149 |
| 1457.0 | 58.504 |
| 1456.0 | 58.364 |
| 1455.0 | 58.849 |
| 1454.0 | 59.806 |
| 1453.0 | 61.179 |
| 1452.0 | 62.642 |
| 1451.0 | 63.771 |
| 1450.0 | 64.153 |
| 1449.0 | 63.469 |
| 1448.0 | 61.653 |
| 1447.0 | 58.85 |
| 1446.0 | 55.751 |
| 1445.0 | 52.549 |
| 1444.0 | 49.696 |
| 1443.0 | 47.683 |
| 1442.0 | 46.426 |
| 1441.0 | 45.975 |
| 1440.0 | 46.261 |
| 1439.0 | 47.19 |
| 1438.0 | 48.19 |
| 1437.0 | 48.963 |
| 1436.0 | 49.018 |
| 1435.0 | 48.032 |
| 1434.0 | 46.059 |
| 1433.0 | 43.239 |
| 1432.0 | 40.225 |
| 1431.0 | 37.305 |
| 1430.0 | 34.94 |
| 1429.0 | 33.327 |
| 1428.0 | 32.457 |
| 1427.0 | 32.421 |
| 1426.0 | 33.237 |
| 1425.0 | 34.948 |
| 1424.0 | 37.5 |
| 1423.0 | 40.612 |
| 1422.0 | 43.843 |
| 1421.0 | 46.794 |
| 1420.0 | 48.858 |
| 1419.0 | 49.375 |
| 1418.0 | 48.468 |
| 1417.0 | 46.574 |
| 1416.0 | 44.316 |
| 1415.0 | 42.214 |
| 1414.0 | 40.395 |
| 1413.0 | 39.337 |
| 1412.0 | 39.304 |
| 1411.0 | 40.197 |
| 1410.0 | 42.137 |
| 1409.0 | 44.996 |
| 1408.0 | 48.432 |
| 1407.0 | 52.338 |
| 1406.0 | 55.959 |
| 1405.0 | 59.209 |
| 1404.0 | 61.482 |
| 1403.0 | 62.309 |
| 1402.0 | 62.021 |
| 1401.0 | 60.874 |
| 1400.0 | 59.355 |
| 1399.0 | 58.075 |
| 1398.0 | 57.46 |
| 1397.0 | 57.641 |
| 1396.0 | 58.496 |
| 1395.0 | 59.694 |
| 1394.0 | 61.066 |
| 1393.0 | 62.85 |
| 1392.0 | 64.946 |
| 1391.0 | 66.897 |
| 1390.0 | 68.456 |
| 1389.0 | 69.846 |
| 1388.0 | 70.753 |
| 1387.0 | 70.842 |
| 1386.0 | 70.115 |
| 1385.0 | 68.541 |
| 1384.0 | 66.051 |
| 1383.0 | 62.618 |
| 1382.0 | 58.855 |
| 1381.0 | 55.441 |
| 1380.0 | 52.858 |
| 1379.0 | 51.138 |
| 1378.0 | 50.38 |
| 1377.0 | 50.651 |
| 1376.0 | 51.902 |
| 1375.0 | 54.047 |
| 1374.0 | 56.862 |
| 1373.0 | 59.844 |
| 1372.0 | 62.136 |
| 1371.0 | 62.723 |
| 1370.0 | 60.986 |
| 1369.0 | 57.523 |
| 1368.0 | 52.876 |
| 1367.0 | 47.917 |
| 1366.0 | 44.016 |
| 1365.0 | 41.232 |
| 1364.0 | 39.557 |
| 1363.0 | 39.351 |
| 1362.0 | 40.873 |
| 1361.0 | 43.852 |
| 1360.0 | 48.018 |
| 1359.0 | 53.18 |
| 1358.0 | 58.374 |
| 1357.0 | 62.202 |
| 1356.0 | 63.227 |
| 1355.0 | 61.049 |
| 1354.0 | 56.837 |
| 1353.0 | 52.395 |
| 1352.0 | 48.651 |
| 1351.0 | 46.367 |
| 1350.0 | 45.852 |
| 1349.0 | 47.108 |
| 1348.0 | 50.123 |
| 1347.0 | 54.914 |
| 1346.0 | 60.968 |
| 1345.0 | 67.421 |
| 1344.0 | 72.57 |
| 1343.0 | 74.994 |
| 1342.0 | 74.661 |
| 1341.0 | 72.222 |
| 1340.0 | 69.225 |
| 1339.0 | 66.726 |
| 1338.0 | 65.65 |
| 1337.0 | 66.348 |
| 1336.0 | 68.7 |
| 1335.0 | 72.02 |
| 1334.0 | 75.289 |
| 1333.0 | 77.061 |
| 1332.0 | 76.054 |
| 1331.0 | 72.082 |
| 1330.0 | 66.113 |
| 1329.0 | 59.803 |
| 1328.0 | 54.35 |
| 1327.0 | 50.427 |
| 1326.0 | 48.418 |
| 1325.0 | 48.308 |
| 1324.0 | 50.125 |
| 1323.0 | 53.654 |
| 1322.0 | 58.52 |
| 1321.0 | 63.649 |
| 1320.0 | 67.159 |
| 1319.0 | 67.681 |
| 1318.0 | 64.797 |
| 1317.0 | 59.693 |
| 1316.0 | 54.035 |
| 1315.0 | 49.291 |
| 1314.0 | 46.076 |
| 1313.0 | 44.52 |
| 1312.0 | 44.858 |
| 1311.0 | 46.794 |
| 1310.0 | 50.254 |
| 1309.0 | 54.99 |
| 1308.0 | 60.351 |
| 1307.0 | 65.226 |
| 1306.0 | 68.808 |
| 1305.0 | 70.571 |
| 1304.0 | 70.636 |
| 1303.0 | 69.807 |
| 1302.0 | 68.938 |
| 1301.0 | 68.678 |
| 1300.0 | 69.353 |
| 1299.0 | 71.018 |
| 1298.0 | 73.415 |
| 1297.0 | 76.158 |
| 1296.0 | 78.768 |
| 1295.0 | 80.827 |
| 1294.0 | 82.131 |
| 1293.0 | 82.704 |
| 1292.0 | 82.819 |
| 1291.0 | 82.691 |
| 1290.0 | 82.47 |
| 1289.0 | 82.064 |
| 1288.0 | 81.156 |
| 1287.0 | 79.502 |
| 1286.0 | 76.956 |
| 1285.0 | 73.626 |
| 1284.0 | 70.004 |
| 1283.0 | 66.693 |
| 1282.0 | 64.199 |
| 1281.0 | 62.983 |
| 1280.0 | 63.315 |
| 1279.0 | 65.21 |
| 1278.0 | 68.394 |
| 1277.0 | 72.454 |
| 1276.0 | 76.284 |
| 1275.0 | 78.57 |
| 1274.0 | 78.687 |
| 1273.0 | 76.525 |
| 1272.0 | 72.817 |
| 1271.0 | 68.691 |
| 1270.0 | 65.243 |
| 1269.0 | 63.158 |
| 1268.0 | 62.757 |
| 1267.0 | 64.033 |
| 1266.0 | 66.779 |
| 1265.0 | 70.628 |
| 1264.0 | 74.882 |
| 1263.0 | 78.719 |
| 1262.0 | 81.418 |
| 1261.0 | 82.569 |
| 1260.0 | 82.274 |
| 1259.0 | 81.155 |
| 1258.0 | 79.871 |
| 1257.0 | 78.914 |
| 1256.0 | 78.647 |
| 1255.0 | 79.13 |
| 1254.0 | 80.145 |
| 1253.0 | 81.405 |
| 1252.0 | 82.612 |
| 1251.0 | 83.583 |
| 1250.0 | 84.206 |
| 1249.0 | 84.553 |
| 1248.0 | 84.837 |
| 1247.0 | 85.177 |
| 1246.0 | 85.671 |
| 1245.0 | 86.282 |
| 1244.0 | 86.787 |
| 1243.0 | 86.974 |
| 1242.0 | 86.647 |
| 1241.0 | 85.79 |
| 1240.0 | 84.55 |
| 1239.0 | 83.287 |
| 1238.0 | 82.384 |
| 1237.0 | 82.088 |
| 1236.0 | 82.564 |
| 1235.0 | 83.738 |
| 1234.0 | 85.409 |
| 1233.0 | 87.119 |
| 1232.0 | 88.363 |
| 1231.0 | 88.776 |
| 1230.0 | 88.178 |
| 1229.0 | 86.812 |
| 1228.0 | 85.097 |
| 1227.0 | 83.575 |
| 1226.0 | 82.66 |
| 1225.0 | 82.532 |
| 1224.0 | 83.24 |
| 1223.0 | 84.589 |
| 1222.0 | 86.158 |
| 1221.0 | 87.521 |
| 1220.0 | 88.292 |
| 1219.0 | 88.273 |
| 1218.0 | 87.482 |
| 1217.0 | 86.285 |
| 1216.0 | 85.102 |
| 1215.0 | 84.299 |
| 1214.0 | 84.142 |
| 1213.0 | 84.663 |
| 1212.0 | 85.696 |
| 1211.0 | 86.957 |
| 1210.0 | 88.007 |
| 1209.0 | 88.499 |
| 1208.0 | 88.276 |
| 1207.0 | 87.467 |
| 1206.0 | 86.385 |
| 1205.0 | 85.42 |
| 1204.0 | 85.018 |
| 1203.0 | 85.37 |
| 1202.0 | 86.321 |
| 1201.0 | 87.594 |
| 1200.0 | 88.848 |
| 1199.0 | 89.619 |
| 1198.0 | 89.61 |
| 1197.0 | 89.012 |
| 1196.0 | 88.176 |
| 1195.0 | 87.567 |
| 1194.0 | 87.535 |
| 1193.0 | 88.164 |
| 1192.0 | 89.326 |
| 1191.0 | 90.639 |
| 1190.0 | 91.558 |
| 1189.0 | 91.731 |
| 1188.0 | 91.198 |
| 1187.0 | 90.272 |
| 1186.0 | 89.428 |
| 1185.0 | 89.108 |
| 1184.0 | 89.527 |
| 1183.0 | 90.6 |
| 1182.0 | 91.968 |
| 1181.0 | 93.1 |
| 1180.0 | 93.545 |
| 1179.0 | 93.128 |
| 1178.0 | 92.048 |
| 1177.0 | 90.77 |
| 1176.0 | 89.844 |
| 1175.0 | 89.612 |
| 1174.0 | 90.22 |
| 1173.0 | 91.421 |
| 1172.0 | 92.814 |
| 1171.0 | 93.857 |
| 1170.0 | 94.137 |
| 1169.0 | 93.639 |
| 1168.0 | 92.668 |
| 1167.0 | 91.71 |
| 1166.0 | 91.196 |
| 1165.0 | 91.459 |
| 1164.0 | 92.343 |
| 1163.0 | 93.549 |
| 1162.0 | 94.575 |
| 1161.0 | 95.059 |
| 1160.0 | 94.896 |
| 1159.0 | 94.367 |
| 1158.0 | 93.849 |
| 1157.0 | 93.698 |
| 1156.0 | 93.999 |
| 1155.0 | 94.496 |
| 1154.0 | 94.78 |
| 1153.0 | 94.549 |
| 1152.0 | 93.717 |
| 1151.0 | 92.629 |
| 1150.0 | 91.796 |
| 1149.0 | 91.655 |
| 1148.0 | 92.397 |
| 1147.0 | 93.849 |
| 1146.0 | 95.27 |
| 1145.0 | 96.185 |
| 1144.0 | 96.103 |
| 1143.0 | 95.067 |
| 1142.0 | 93.57 |
| 1141.0 | 92.356 |
| 1140.0 | 91.999 |
| 1139.0 | 92.675 |
| 1138.0 | 94.079 |
| 1137.0 | 95.667 |
| 1136.0 | 96.67 |
| 1135.0 | 96.532 |
| 1134.0 | 95.401 |
| 1133.0 | 93.889 |
| 1132.0 | 92.552 |
| 1131.0 | 92.157 |
| 1130.0 | 92.814 |
| 1129.0 | 94.316 |
| 1128.0 | 96.111 |
| 1127.0 | 97.107 |
| 1126.0 | 97.085 |
| 1125.0 | 95.96 |
| 1124.0 | 94.485 |
| 1123.0 | 93.439 |
| 1122.0 | 93.367 |
| 1121.0 | 94.364 |
| 1120.0 | 95.973 |
| 1119.0 | 97.256 |
| 1118.0 | 97.462 |
| 1117.0 | 96.24 |
| 1116.0 | 94.112 |
| 1115.0 | 92.029 |
| 1114.0 | 90.917 |
| 1113.0 | 91.144 |
| 1112.0 | 92.66 |
| 1111.0 | 94.891 |
| 1110.0 | 96.906 |
| 1109.0 | 97.932 |
| 1108.0 | 97.708 |
| 1107.0 | 96.585 |
| 1106.0 | 95.282 |
| 1105.0 | 94.455 |
| 1104.0 | 94.405 |
| 1103.0 | 95.093 |
| 1102.0 | 96.177 |
| 1101.0 | 97.221 |
| 1100.0 | 97.867 |
| 1099.0 | 98.099 |
| 1098.0 | 98.007 |
| 1097.0 | 97.845 |
| 1096.0 | 97.915 |
| 1095.0 | 98.139 |
| 1094.0 | 98.503 |
| 1093.0 | 98.839 |
| 1092.0 | 99.048 |
| 1091.0 | 99.081 |
| 1090.0 | 99.01 |
| 1089.0 | 98.913 |
| 1088.0 | 98.869 |
| 1087.0 | 98.943 |
| 1086.0 | 99.05 |
| 1085.0 | 99.138 |
| 1084.0 | 99.239 |
| 1083.0 | 99.28 |
| 1082.0 | 99.272 |
| 1081.0 | 99.302 |
| 1080.0 | 99.39 |
| 1079.0 | 99.441 |
| 1078.0 | 99.481 |
| 1077.0 | 99.519 |
| 1076.0 | 99.517 |
| 1075.0 | 99.531 |
| 1074.0 | 99.541 |
| 1073.0 | 99.522 |
| 1072.0 | 99.526 |
| 1071.0 | 99.462 |
| 1070.0 | 99.411 |
| 1069.0 | 99.389 |
| 1068.0 | 99.443 |
| 1067.0 | 99.524 |
| 1066.0 | 99.607 |
| 1065.0 | 99.676 |
| 1064.0 | 99.681 |
| 1063.0 | 99.716 |
| 1062.0 | 99.707 |
| 1061.0 | 99.748 |
| 1060.0 | 98.916 |
| 1059.0 | 98.91 |
| 1058.0 | 98.921 |
| 1057.0 | 98.024 |
| 1056.0 | 97.914 |
| 1055.0 | 98.637 |
| 1054.0 | 98.763 |
| 1053.0 | 98.259 |
| 1052.0 | 98.68 |
| 1051.0 | 98.437 |
| 1050.0 | 98.332 |
| 1049.0 | 98.781 |
| 1048.0 | 97.935 |
| 1047.0 | 97.924 |
| 1046.0 | 98.663 |
| 1045.0 | 98.678 |
| 1044.0 | 98.345 |
| 1043.0 | 99.315 |
| 1042.0 | 98.956 |
| 1041.0 | 98.847 |
| 1040.0 | 99.856 |
| 1039.0 | 99.614 |
| 1038.0 | 98.816 |
| 1037.0 | 99.181 |
| 1036.0 | 98.579 |
| 1035.0 | 98.91 |
| 1034.0 | 98.904 |
| 1033.0 | 98.915 |
| 1032.0 | 98.018 |
| 1031.0 | 97.908 |
| 1030.0 | 98.632 |
| 1029.0 | 98.758 |
| 1028.0 | 98.254 |
| 1027.0 | 98.674 |
| 1026.0 | 98.432 |
| 1025.0 | 98.327 |
| 1024.0 | 98.776 |
| 1023.0 | 98.511 |
| 1022.0 | 98.5 |
| 1021.0 | 98.739 |
| 1020.0 | 98.566 |
| 1019.0 | 98.234 |
| 1018.0 | 99.203 |
| 1017.0 | 98.844 |
| 1016.0 | 98.735 |
| 1015.0 | 99.744 |
| 1014.0 | 99.502 |
| 1013.0 | 98.704 |
| 1012.0 | 99.069 |
| 1011.0 | 98.467 |
| 1010.0 | 98.91 |
| 1009.0 | 98.904 |
| 1008.0 | 98.915 |
| 1007.0 | 98.018 |
| 1006.0 | 99.31 |
| 1005.0 | 98.632 |
| 1004.0 | 98.758 |
| 1003.0 | 98.254 |
| 1002.0 | 98.674 |
| 1001.0 | 98.432 |
| 1000.0 | 98.327 |
| 999.0 | 98.776 |
| 998.0 | 97.929 |
| 997.0 | 97.918 |
| 996.0 | 98.657 |
| 995.0 | 98.445 |
| 994.0 | 98.113 |
| 993.0 | 99.082 |
| 992.0 | 98.723 |
| 991.0 | 98.614 |
| 990.0 | 99.345 |
| 989.0 | 99.103 |
| 988.0 | 98.591 |
| 987.0 | 98.956 |
| 986.0 | 98.354 |
| 985.0 | 98.626 |
| 984.0 | 98.621 |
| 983.0 | 98.631 |
| 982.0 | 97.735 |
| 981.0 | 97.903 |
| 980.0 | 98.626 |
| 979.0 | 98.752 |
| 978.0 | 98.248 |
| 977.0 | 98.668 |
| 976.0 | 98.426 |
| 975.0 | 98.321 |
| 974.0 | 98.77 |
| 973.0 | 98.505 |
| 972.0 | 98.494 |
| 971.0 | 98.733 |
| 970.0 | 98.56 |
| 969.0 | 98.228 |
| 968.0 | 99.197 |
| 967.0 | 98.838 |
| 966.0 | 98.729 |
| 965.0 | 99.438 |
| 964.0 | 99.196 |
| 963.0 | 98.398 |
| 962.0 | 98.764 |
| 961.0 | 98.161 |
| 960.0 | 98.721 |
| 959.0 | 98.97 |
| 958.0 | 98.98 |
| 957.0 | 97.966 |
| 956.0 | 97.719 |
| 955.0 | 98.697 |
| 954.0 | 98.823 |
| 953.0 | 98.201 |
| 952.0 | 98.485 |
| 951.0 | 98.497 |
| 950.0 | 98.392 |
| 949.0 | 98.723 |
| 948.0 | 97.74 |
| 947.0 | 97.983 |
| 946.0 | 98.722 |
| 945.0 | 98.619 |
| 944.0 | 98.151 |
| 943.0 | 99.375 |
| 942.0 | 99.016 |
| 941.0 | 98.789 |
| 940.0 | 99.661 |
| 939.0 | 99.674 |
| 938.0 | 98.875 |
| 937.0 | 99.123 |
| 936.0 | 98.384 |
| 935.0 | 98.97 |
| 934.0 | 98.964 |
| 933.0 | 98.857 |
| 932.0 | 97.823 |
| 931.0 | 97.968 |
| 930.0 | 98.691 |
| 929.0 | 98.699 |
| 928.0 | 98.059 |
| 927.0 | 98.734 |
| 926.0 | 98.492 |
| 925.0 | 98.268 |
| 924.0 | 98.581 |
| 923.0 | 98.571 |
| 922.0 | 98.559 |
| 921.0 | 98.68 |
| 920.0 | 98.371 |
| 919.0 | 98.293 |
| 918.0 | 99.263 |
| 917.0 | 98.786 |
| 916.0 | 98.54 |
| 915.0 | 99.804 |
| 914.0 | 99.562 |
| 913.0 | 98.645 |
| 912.0 | 98.875 |
| 911.0 | 98.527 |
| 910.0 | 98.97 |
| 909.0 | 98.846 |
| 908.0 | 98.72 |
| 907.0 | 98.078 |
| 906.0 | 99.369 |
| 905.0 | 98.573 |
| 904.0 | 98.563 |
| 903.0 | 98.313 |
| 902.0 | 98.734 |
| 901.0 | 98.373 |
| 900.0 | 98.132 |
| 899.0 | 98.835 |
| 898.0 | 97.989 |
| 897.0 | 97.86 |
| 896.0 | 98.462 |
| 895.0 | 98.446 |
| 894.0 | 98.114 |
| 893.0 | 98.965 |
| 892.0 | 98.47 |
| 891.0 | 98.615 |
| 890.0 | 99.346 |
| 889.0 | 98.986 |
| 888.0 | 98.337 |
| 887.0 | 98.957 |
| 886.0 | 98.355 |
| 885.0 | 98.568 |
| 884.0 | 98.426 |
| 883.0 | 98.691 |
| 882.0 | 97.794 |
| 881.0 | 97.844 |
| 880.0 | 98.431 |
| 879.0 | 98.812 |
| 878.0 | 98.308 |
| 877.0 | 98.61 |
| 876.0 | 98.231 |
| 875.0 | 98.381 |
| 874.0 | 98.83 |
| 873.0 | 98.447 |
| 872.0 | 98.299 |
| 871.0 | 98.793 |
| 870.0 | 98.62 |
| 869.0 | 98.17 |
| 868.0 | 99.003 |
| 867.0 | 98.898 |
| 866.0 | 98.789 |
| 865.0 | 99.38 |
| 864.0 | 99.002 |
| 863.0 | 98.458 |
| 862.0 | 98.824 |
| 861.0 | 98.103 |
| 860.0 | 98.532 |
| 859.0 | 98.898 |
| 858.0 | 98.295 |
| 857.0 | 98.626 |
| 856.0 | 98.532 |
| 855.0 | 98.874 |
| 854.0 | 98.271 |
| 853.0 | 98.603 |
| 852.0 | 98.597 |
| 851.0 | 98.608 |
| 850.0 | 98.916 |
| 849.0 | 98.91 |
| 848.0 | 98.921 |
| 847.0 | 98.024 |
| 846.0 | 97.914 |
| 845.0 | 98.637 |
| 844.0 | 98.763 |
| 843.0 | 98.259 |
| 842.0 | 98.68 |
| 841.0 | 98.437 |
| 840.0 | 98.332 |
| 839.0 | 98.781 |
| 838.0 | 97.935 |
| 837.0 | 97.924 |
| 836.0 | 98.663 |
| 835.0 | 98.678 |
| 834.0 | 98.345 |
| 833.0 | 99.315 |
| 832.0 | 98.956 |
| 831.0 | 98.847 |
| 830.0 | 99.856 |
| 829.0 | 99.614 |
| 828.0 | 98.816 |
| 827.0 | 99.181 |
| 826.0 | 98.579 |
| 825.0 | 90.422 |
| 824.0 | 60.541 |
| 823.0 | 21.464 |
| 822.0 | 3.006 |
| 821.0 | 0.197 |
| 820.0 | 0.03 |
| 819.0 | 0.007 |
| 818.0 | 0.001 |
| 817.0 | 0 |
| 816.0 | 0 |
| 815.0 | 0 |
| 814.0 | 0 |
| 813.0 | 0 |
| 812.0 | 0 |
| 811.0 | 0 |
| 810.0 | 0 |
| 809.0 | 0 |
| 808.0 | 0 |
| 807.0 | 0 |
| 806.0 | 0 |
| 805.0 | 0 |
| 804.0 | 0 |
| 803.0 | 0 |
| 802.0 | 0 |
| 801.0 | 0 |
| 800.0 | 0.001 |
| 799.0 | 0.003 |
| 798.0 | 0.015 |
| 797.0 | 0.103 |
| 796.0 | 1.992 |
| 795.0 | 23.841 |
| 794.0 | 55.306 |
| 793.0 | 87.263 |
| 792.0 | 98.175 |
| 791.0 | 98.443 |
| 790.0 | 98.651 |
| 789.0 | 99.358 |
| 788.0 | 98.628 |
| 787.0 | 98.653 |
| 786.0 | 99.65 |
| 785.0 | 98.707 |
| 784.0 | 99.126 |
| 783.0 | 99.529 |
| 782.0 | 98.248 |
| 781.0 | 98.258 |
| 780.0 | 99.19 |
| 779.0 | 98.916 |
| 778.0 | 98.91 |
| 777.0 | 98.921 |
| 776.0 | 98.024 |
| 775.0 | 97.914 |
| 774.0 | 98.637 |
| 773.0 | 98.763 |
| 772.0 | 98.259 |
| 771.0 | 98.68 |
| 770.0 | 98.437 |
| 769.0 | 98.332 |
| 768.0 | 98.781 |
| 767.0 | 97.935 |
| 766.0 | 97.924 |
| 765.0 | 98.663 |
| 764.0 | 98.678 |
| 763.0 | 98.345 |
| 762.0 | 99.315 |
| 761.0 | 98.956 |
| 760.0 | 98.847 |
| 759.0 | 99.856 |
| 758.0 | 99.614 |
| 757.0 | 98.816 |
| 756.0 | 99.181 |
| 755.0 | 98.579 |
| 754.0 | 98.91 |
| 753.0 | 98.904 |
| 752.0 | 98.915 |
| 751.0 | 98.018 |
| 750.0 | 97.908 |
| 749.0 | 98.632 |
| 748.0 | 98.758 |
| 747.0 | 98.254 |
| 746.0 | 98.674 |
| 745.0 | 98.432 |
| 744.0 | 98.327 |
| 743.0 | 98.776 |
| 742.0 | 98.511 |
| 741.0 | 98.5 |
| 740.0 | 98.739 |
| 739.0 | 98.566 |
| 738.0 | 98.234 |
| 737.0 | 99.203 |
| 736.0 | 98.844 |
| 735.0 | 98.735 |
| 734.0 | 99.744 |
| 733.0 | 99.502 |
| 732.0 | 98.908 |
| 731.0 | 99.273 |
| 730.0 | 98.671 |
| 729.0 | 99.114 |
| 728.0 | 99.108 |
| 727.0 | 99.119 |
| 726.0 | 98.222 |
| 725.0 | 99.31 |
| 724.0 | 98.632 |
| 723.0 | 98.758 |
| 722.0 | 98.254 |
| 721.0 | 98.732 |
| 720.0 | 98.489 |
| 719.0 | 98.384 |
| 718.0 | 98.833 |
| 717.0 | 97.987 |
| 716.0 | 97.976 |
| 715.0 | 98.715 |
| 714.0 | 98.444 |
| 713.0 | 98.112 |
| 712.0 | 99.081 |
| 711.0 | 98.722 |
| 710.0 | 98.613 |
| 709.0 | 99.344 |
| 708.0 | 99.102 |
| 707.0 | 98.59 |
| 706.0 | 98.955 |
| 705.0 | 98.353 |
| 704.0 | 98.684 |
| 703.0 | 98.678 |
| 702.0 | 98.689 |
| 701.0 | 97.792 |
| 700.0 | 97.96 |
| 699.0 | 99.091 |
| 698.0 | 99.217 |
| 697.0 | 98.713 |
| 696.0 | 99.134 |
| 695.0 | 98.892 |
| 694.0 | 98.786 |
| 693.0 | 99.235 |
| 692.0 | 98.971 |
| 691.0 | 98.959 |
| 690.0 | 99.141 |
| 689.0 | 98.968 |
| 688.0 | 98.636 |
| 687.0 | 99.197 |
| 686.0 | 98.838 |
| 685.0 | 98.729 |
| 684.0 | 99.438 |
| 683.0 | 99.196 |
| 682.0 | 98.398 |
| 681.0 | 98.764 |
| 680.0 | 98.161 |
| 679.0 | 98.721 |
| 678.0 | 98.97 |
| 677.0 | 98.98 |
| 676.0 | 97.966 |
| 675.0 | 97.719 |
| 674.0 | 98.697 |
| 673.0 | 98.823 |
| 672.0 | 98.201 |
| 671.0 | 98.485 |
| 670.0 | 98.497 |
| 669.0 | 98.392 |
| 668.0 | 98.723 |
| 667.0 | 97.74 |
| 666.0 | 97.983 |
| 665.0 | 98.722 |
| 664.0 | 98.619 |
| 663.0 | 98.151 |
| 662.0 | 99.375 |
| 661.0 | 99.016 |
| 660.0 | 98.789 |
| 659.0 | 99.661 |
| 658.0 | 99.674 |
| 657.0 | 98.875 |
| 656.0 | 99.123 |
| 655.0 | 98.384 |
| 654.0 | 98.97 |
| 653.0 | 98.964 |
| 652.0 | 98.857 |
| 651.0 | 97.823 |
| 650.0 | 97.968 |
| 649.0 | 98.691 |
| 648.0 | 98.699 |
| 647.0 | 98.059 |
| 646.0 | 98.734 |
| 645.0 | 98.492 |
| 644.0 | 98.268 |
| 643.0 | 98.581 |
| 642.0 | 98.571 |
| 641.0 | 98.559 |
| 640.0 | 98.68 |
| 639.0 | 98.371 |
| 638.0 | 98.293 |
| 637.0 | 99.263 |
| 636.0 | 98.786 |
| 635.0 | 98.54 |
| 634.0 | 99.804 |
| 633.0 | 99.562 |
| 632.0 | 98.645 |
| 631.0 | 98.875 |
| 630.0 | 98.527 |
| 629.0 | 98.97 |
| 628.0 | 98.384 |
| 627.0 | 98.833 |
| 626.0 | 97.987 |
| 625.0 | 97.976 |
| 624.0 | 98.715 |
| 623.0 | 98.444 |
| 622.0 | 98.112 |
| 621.0 | 99.081 |
| 620.0 | 98.722 |
| 619.0 | 98.613 |
| 618.0 | 99.027 |
| 617.0 | 98.441 |
| 616.0 | 98.89 |
| 615.0 | 98.044 |
| 614.0 | 98.032 |
| 613.0 | 98.771 |
| 612.0 | 98.501 |
| 611.0 | 98.169 |
| 610.0 | 99.203 |
| 609.0 | 98.451 |
| 608.0 | 98.456 |
| 607.0 | 98.371 |
| 606.0 | 98.346 |
| 605.0 | 98.148 |
| 604.0 | 97.908 |
| 603.0 | 97.896 |
| 602.0 | 97.907 |
| 601.0 | 97.921 |
| 600.0 | 98.018 |
| 599.0 | 97.906 |
| 598.0 | 97.345 |
| 597.0 | 94.657 |
| 596.0 | 88.473 |
| 595.0 | 84.162 |
| 594.0 | 83.032 |
| 593.0 | 80.112 |
| 592.0 | 74.197 |
| 591.0 | 70.601 |
| 590.0 | 69.49 |
| 589.0 | 63.878 |
| 588.0 | 56.913 |
| 587.0 | 51.026 |
| 586.0 | 48.234 |
| 585.0 | 48.77 |
| 584.0 | 48.197 |
| 583.0 | 47.212 |
| 582.0 | 46.052 |
| 581.0 | 45.606 |
| 580.0 | 45.525 |
| 579.0 | 41.121 |
| 578.0 | 34.472 |
| 577.0 | 29.747 |
| 576.0 | 25.437 |
| 575.0 | 21.946 |
| 574.0 | 19.628 |
| 573.0 | 16.65 |
| 572.0 | 15.489 |
| 571.0 | 16.455 |
| 570.0 | 16.2 |
| 569.0 | 13.876 |
| 568.0 | 10.382 |
| 567.0 | 7.703 |
| 566.0 | 6.886 |
| 565.0 | 6.588 |
| 564.0 | 5.645 |
| 563.0 | 4.586 |
| 562.0 | 3.609 |
| 561.0 | 2.723 |
| 560.0 | 2.527 |
| 559.0 | 2.215 |
| 558.0 | 1.335 |
| 557.0 | 0.684 |
| 556.0 | 0.418 |
| 555.0 | 0.237 |
| 554.0 | 0.114 |
| 553.0 | 0.044 |
| 552.0 | 0.015 |
| 551.0 | 0.002 |
| 550.0 | 0.002 |
| 549.0 | 0.005 |
| 548.0 | 0.006 |
| 547.0 | 0.006 |
| 546.0 | 0.004 |
| 545.0 | 0.006 |
| 544.0 | 0.003 |
| 543.0 | 0.004 |
| 542.0 | 0.006 |
| 541.0 | 0.007 |
| 540.0 | 0.006 |
| 539.0 | 0.005 |
| 538.0 | 0.002 |
| 537.0 | 0.004 |
| 536.0 | 0.006 |
| 535.0 | 0.007 |
| 534.0 | 0.006 |
| 533.0 | 0.004 |
| 532.0 | 0.004 |
| 531.0 | 0.006 |
| 530.0 | 0.006 |
| 529.0 | 0.005 |
| 528.0 | 0.004 |
| 527.0 | 0.005 |
| 526.0 | 0.003 |
| 525.0 | 0.004 |
| 524.0 | 0.007 |
| 523.0 | 0.006 |
| 522.0 | 0.006 |
| 521.0 | 0.005 |
| 520.0 | 0.003 |
| 519.0 | 0.004 |
| 518.0 | 0.007 |
| 517.0 | 0.005 |
| 516.0 | 0.005 |
| 515.0 | 0.006 |
| 514.0 | 0.003 |
| 513.0 | 0.004 |
| 512.0 | 0.006 |
| 511.0 | 0.005 |
| 510.0 | 0.005 |
| 509.0 | 0.005 |
| 508.0 | 0.003 |
| 507.0 | 0.004 |
| 506.0 | 0.006 |
| 505.0 | 0.005 |
| 504.0 | 0.005 |
| 503.0 | 0.005 |
| 502.0 | 0.003 |
| 501.0 | 0.003 |
| 500.0 | 0.006 |
| 499.0 | 0.006 |
| 498.0 | 0.005 |
| 497.0 | 0.005 |
| 496.0 | 0.003 |
| 495.0 | 0.004 |
| 494.0 | 0.006 |
| 493.0 | 0.006 |
| 492.0 | 0.007 |
| 491.0 | 0.004 |
| 490.0 | 0.003 |
| 489.0 | 0.004 |
| 488.0 | 0.006 |
| 487.0 | 0.005 |
| 486.0 | 0.005 |
| 485.0 | 0.005 |
| 484.0 | 0.003 |
| 483.0 | 0.005 |
| 482.0 | 0.006 |
| 481.0 | 0.006 |
| 480.0 | 0.006 |
| 479.0 | 0.005 |
| 478.0 | 0.003 |
| 477.0 | 0.005 |
| 476.0 | 0.006 |
| 475.0 | 0.005 |
| 474.0 | 0.005 |
| 473.0 | 0.004 |
| 472.0 | 0.003 |
| 471.0 | 0.005 |
| 470.0 | 0.007 |
| 469.0 | 0.006 |
| 468.0 | 0.006 |
| 467.0 | 0.005 |
| 466.0 | 0.003 |
| 465.0 | 0.005 |
| 464.0 | 0.007 |
| 463.0 | 0.007 |
| 462.0 | 0.006 |
| 461.0 | 0.004 |
| 460.0 | 0.003 |
| 459.0 | 0.004 |
| 458.0 | 0.005 |
| 457.0 | 0.006 |
| 456.0 | 0.007 |
| 455.0 | 0.005 |
| 454.0 | 0.002 |
| 453.0 | 0.004 |
| 452.0 | 0.006 |
| 451.0 | 0.006 |
| 450.0 | 0.007 |
| 449.0 | 0.004 |
| 448.0 | 0.002 |
| 447.0 | 0.004 |
| 446.0 | 0.006 |
| 445.0 | 0.007 |
| 444.0 | 0.006 |
| 443.0 | 0.003 |
| 442.0 | 0.002 |
| 441.0 | 0.004 |
| 440.0 | 0.006 |
| 439.0 | 0.006 |
| 438.0 | 0.005 |
| 437.0 | 0.004 |
| 436.0 | 0.003 |
| 435.0 | 0.005 |
| 434.0 | 0.007 |
| 433.0 | 0.005 |
| 432.0 | 0.005 |
| 431.0 | 0.005 |
| 430.0 | 0.003 |
| 429.0 | 0.005 |
| 428.0 | 0.006 |
| 427.0 | 0.005 |
| 426.0 | 0.005 |
| 425.0 | 0.004 |
| 424.0 | 0.002 |
| 423.0 | 0.005 |
| 422.0 | 0.006 |
| 421.0 | 0.003 |
| 420.0 | 0.004 |
| 419.0 | 0.004 |
| 418.0 | 0.001 |
| 417.0 | 0.006 |
| 416.0 | 0.008 |
| 415.0 | 0.006 |
| 414.0 | 0.005 |
| 413.0 | 0.004 |
| 412.0 | 0.002 |
| 411.0 | 0.005 |
| 410.0 | 0.007 |
| 409.0 | 0.007 |
| 408.0 | 0.006 |
| 407.0 | 0.005 |
| 406.0 | 0.003 |
| 405.0 | 0.005 |
| 404.0 | 0.005 |
| 403.0 | 0.004 |
| 402.0 | 0.005 |
| 401.0 | 0.004 |
| 400.0 | 0.001 |
| 399.0 | 0.001 |
| 398.0 | 0.004 |
| 397.0 | 0.028 |
| 396.0 | 0.051 |
| 395.0 | 0.129 |
| 394.0 | 0.558 |
| 393.0 | 1.577 |
| 392.0 | 2.294 |
| 391.0 | 1.709 |
| 390.0 | 0.904 |
| 389.0 | 0.719 |
| 388.0 | 0.55 |
| 387.0 | 0.275 |
| 386.0 | 0.17 |
| 385.0 | 0.164 |
| 384.0 | 0.108 |
| 383.0 | 0.177 |
| 382.0 | 0.524 |
| 381.0 | 0.807 |
| 380.0 | 1.233 |
| 379.0 | 1.726 |
| 378.0 | 1.341 |
| 377.0 | 0.667 |
| 376.0 | 0.43 |
| 375.0 | 0.459 |
| 374.0 | 0.912 |
| 373.0 | 2.383 |
| 372.0 | 4.387 |
| 371.0 | 5.55 |
| 370.0 | 4.908 |
| 369.0 | 2.988 |
| 368.0 | 1.316 |
| 367.0 | 0.603 |
| 366.0 | 0.41 |
| 365.0 | 0.492 |
| 364.0 | 0.665 |
| 363.0 | 0.612 |
| 362.0 | 0.341 |
| 361.0 | 0.13 |
| 360.0 | 0.063 |
| 359.0 | 0.042 |
| 358.0 | 0.015 |
| 357.0 | 0 |
| 356.0 | 0.006 |
| 355.0 | 0.002 |
| 354.0 | 0.002 |
| 353.0 | 0.004 |
| 352.0 | 0.006 |
| 351.0 | 0.006 |
| 350.0 | 0.007 |
| 349.0 | 0.002 |
| 348.0 | 0.001 |
| 347.0 | 0.006 |
| 346.0 | 0.007 |
| 345.0 | 0.004 |
| 344.0 | 0.006 |
| 343.0 | 0.001 |
| 342.0 | 0.002 |
| 341.0 | 0.004 |
| 340.0 | 0.007 |
| 339.0 | 0.006 |
| 338.0 | 0.006 |
| 337.0 | 0.002 |
| 336.0 | 0.002 |
| 335.0 | 0.006 |
| 334.0 | 0.006 |
| 333.0 | 0.006 |
| 332.0 | 0.006 |
| 331.0 | 0.002 |
| 330.0 | 0.003 |
| 329.0 | 0.005 |
| 328.0 | 0.007 |
| 327.0 | 0.006 |
| 326.0 | 0.005 |
| 325.0 | 0.002 |
| 324.0 | 0.001 |
| 323.0 | 0.006 |
| 322.0 | 0.006 |
| 321.0 | 0.007 |
| 320.0 | 0.006 |
| 319.0 | 0.002 |
| 318.0 | 0.005 |
| 317.0 | 0.005 |
| 316.0 | 0.004 |
| 315.0 | 0.002 |
| 314.0 | 0.005 |
| 313.0 | 0.001 |
| 312.0 | 0.002 |
| 311.0 | 0.005 |
| 310.0 | 0.006 |
| 309.0 | 0.003 |
| 308.0 | 0.006 |
| 307.0 | 0.001 |
| 306.0 | 0.005 |
| 305.0 | 0.005 |
| 304.0 | 0.006 |
| 303.0 | 0.002 |
| 302.0 | 0.006 |
| 301.0 | 0.001 |
| 300.0 | 0.002 |
| 299.0 | 0.004 |
| 298.0 | 0.007 |
| 297.0 | 0.003 |
| 296.0 | 0.006 |
| 295.0 | 0.001 |
| 294.0 | 0.001 |
| 293.0 | 0.004 |
| 292.0 | 0.007 |
| 291.0 | 0.002 |
| 290.0 | 0.006 |
| 289.0 | 0.001 |
| 288.0 | 0.002 |
| 287.0 | 0.005 |
| 286.0 | 0.007 |
| 285.0 | 0.001 |
| 284.0 | 0.005 |
| 283.0 | 0.002 |
| 282.0 | 0.002 |
| 281.0 | 0.004 |
| 280.0 | 0.006 |
| 279.0 | 0.006 |
| 278.0 | 0.006 |
| 277.0 | 0.004 |
| 276.0 | 0.004 |
| 275.0 | 0.005 |
| 274.0 | 0.007 |
| 273.0 | 0.006 |
| 272.0 | 0.005 |
| 271.0 | 0.005 |
| 270.0 | 0.005 |
| 269.0 | 0.006 |
| 268.0 | 0.003 |
| 267.0 | 0.001 |
| 266.0 | 0.001 |
| 265.0 | 0.001 |
| 264.0 | 0.001 |
| 263.0 | 0.001 |
| 262.0 | 0.007 |
| 261.0 | 0.007 |
| 260.0 | 0.002 |
| 259.0 | 0.007 |
| 258.0 | 0.001 |
| 257.0 | 0.004 |
| 256.0 | 0.004 |
| 255.0 | 0.008 |
| 254.0 | 0.001 |
| 253.0 | 0.007 |
| 252.0 | 0.001 |
| 251.0 | 0.002 |
| 250.0 | 0.007 |
| 249.0 | 0.007 |
| 248.0 | 0.002 |
| 247.0 | 0.007 |
| 246.0 | 0 |
| 245.0 | 0.003 |
| 244.0 | 0.005 |
| 243.0 | 0.007 |
| 242.0 | 0.005 |
| 241.0 | 0.006 |
| 240.0 | 0.001 |
| 239.0 | 0.004 |
| 238.0 | 0.007 |
| 237.0 | 0.008 |
| 236.0 | 0.002 |
| 235.0 | 0.007 |
| 234.0 | 0.001 |
| 233.0 | 0.003 |
| 232.0 | 0.007 |
| 231.0 | 0.007 |
| 230.0 | 0.005 |
| 229.0 | 0.006 |
| 228.0 | 0.002 |
| 227.0 | 0.003 |
| 226.0 | 0.007 |
| 225.0 | 0.007 |
| 224.0 | 0.007 |
| 223.0 | 0.007 |
| 222.0 | 0.003 |
| 221.0 | 0.002 |
| 220.0 | 0.008 |
| 219.0 | 0.006 |
| 218.0 | 0.005 |
| 217.0 | 0.007 |
| 216.0 | 0.003 |
| 215.0 | 0.003 |
| 214.0 | 0.008 |
| 213.0 | 0.007 |
| 212.0 | 0.005 |
| 211.0 | 0.006 |
| 210.0 | 0.003 |
| 209.0 | 0.002 |
| 208.0 | 0.008 |
| 207.0 | 0.008 |
| 206.0 | 0.006 |
| 205.0 | 0.007 |
| 204.0 | 0.005 |
| 203.0 | 0.005 |
| 202.0 | 0.011 |
| 201.0 | 0.01 |
| 200.0 | 0.01 |